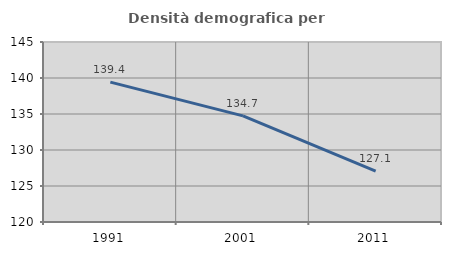
| Category | Densità demografica |
|---|---|
| 1991.0 | 139.433 |
| 2001.0 | 134.734 |
| 2011.0 | 127.077 |